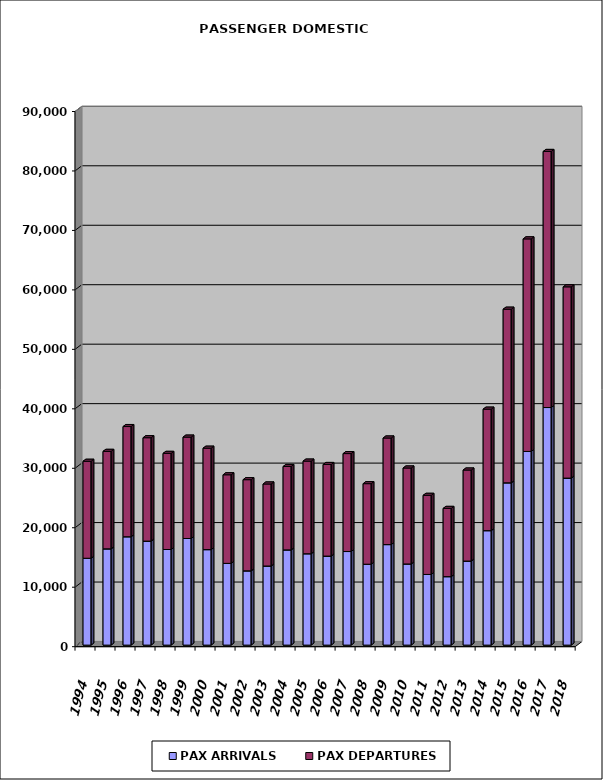
| Category | PAX ARRIVALS | PAX DEPARTURES |
|---|---|---|
| 1994.0 | 14610 | 16305 |
| 1995.0 | 16190 | 16394 |
| 1996.0 | 18225 | 18533 |
| 1997.0 | 17492 | 17389 |
| 1998.0 | 16083 | 16162 |
| 1999.0 | 17928 | 17051 |
| 2000.0 | 16060 | 17056 |
| 2001.0 | 13748 | 14899 |
| 2002.0 | 12490 | 15333 |
| 2003.0 | 13306 | 13792 |
| 2004.0 | 16014 | 14029 |
| 2005.0 | 15366 | 15578 |
| 2006.0 | 14972 | 15406 |
| 2007.0 | 15739 | 16472 |
| 2008.0 | 13608 | 13543 |
| 2009.0 | 16908 | 17921 |
| 2010.0 | 13650 | 16137 |
| 2011.0 | 11886 | 13305 |
| 2012.0 | 11516 | 11475 |
| 2013.0 | 14138 | 15308 |
| 2014.0 | 19252 | 20431 |
| 2015.0 | 27294 | 29199 |
| 2016.0 | 32570 | 35748 |
| 2017.0 | 39957 | 43064 |
| 2018.0 | 28089 | 32165 |